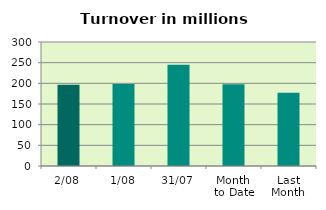
| Category | Series 0 |
|---|---|
| 2/08 | 196.415 |
| 1/08 | 198.582 |
| 31/07 | 245.095 |
| Month 
to Date | 197.498 |
| Last
Month | 177.022 |